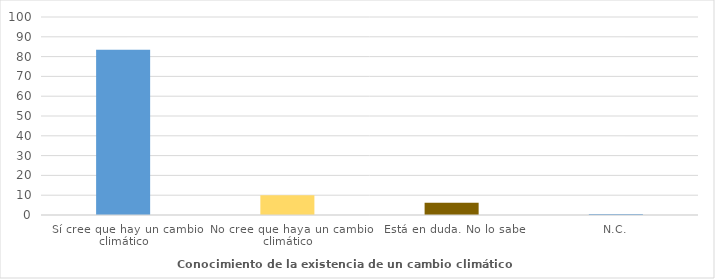
| Category | Series 0 |
|---|---|
| Sí cree que hay un cambio climático | 83.4 |
| No cree que haya un cambio climático | 10 |
| Está en duda. No lo sabe | 6.2 |
| N.C. | 0.5 |